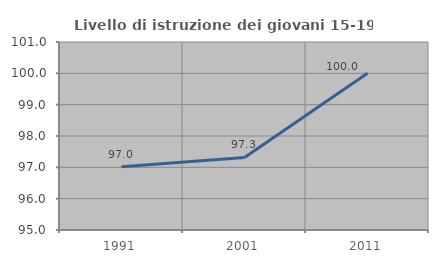
| Category | Livello di istruzione dei giovani 15-19 anni |
|---|---|
| 1991.0 | 97.015 |
| 2001.0 | 97.315 |
| 2011.0 | 100 |